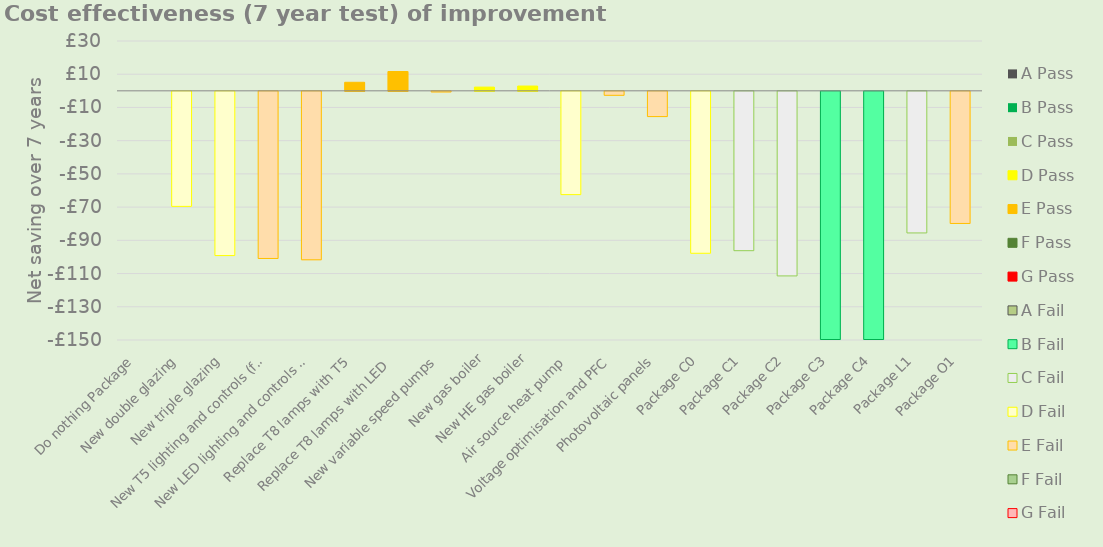
| Category | A Pass | B Pass | C Pass | D Pass | E Pass | F Pass | G Pass | A Fail | B Fail | C Fail | D Fail | E Fail | F Fail | G Fail |
|---|---|---|---|---|---|---|---|---|---|---|---|---|---|---|
| Do nothing Package | 0 | 0 | 0 | 0 | 0 | 0 | 0 | 0 | 0 | 0 | 0 | 0 | 0 | 0 |
| New double glazing | 0 | 0 | 0 | 0 | 0 | 0 | 0 | 0 | 0 | 0 | -69.256 | 0 | 0 | 0 |
| New triple glazing | 0 | 0 | 0 | 0 | 0 | 0 | 0 | 0 | 0 | 0 | -98.873 | 0 | 0 | 0 |
| New T5 lighting and controls (full) | 0 | 0 | 0 | 0 | 0 | 0 | 0 | 0 | 0 | 0 | 0 | -100.618 | 0 | 0 |
| New LED lighting and controls (full) | 0 | 0 | 0 | 0 | 0 | 0 | 0 | 0 | 0 | 0 | 0 | -101.411 | 0 | 0 |
| Replace T8 lamps with T5 | 0 | 0 | 0 | 0 | 5.145 | 0 | 0 | 0 | 0 | 0 | 0 | 0 | 0 | 0 |
| Replace T8 lamps with LED  | 0 | 0 | 0 | 0 | 11.631 | 0 | 0 | 0 | 0 | 0 | 0 | 0 | 0 | 0 |
| New variable speed pumps | 0 | 0 | 0 | 0 | 0 | 0 | 0 | 0 | 0 | 0 | 0 | -0.39 | 0 | 0 |
| New gas boiler | 0 | 0 | 0 | 2.237 | 0 | 0 | 0 | 0 | 0 | 0 | 0 | 0 | 0 | 0 |
| New HE gas boiler | 0 | 0 | 0 | 2.876 | 0 | 0 | 0 | 0 | 0 | 0 | 0 | 0 | 0 | 0 |
| Air source heat pump | 0 | 0 | 0 | 0 | 0 | 0 | 0 | 0 | 0 | 0 | -62.176 | 0 | 0 | 0 |
| Voltage optimisation and PFC | 0 | 0 | 0 | 0 | 0 | 0 | 0 | 0 | 0 | 0 | 0 | -2.394 | 0 | 0 |
| Photovoltaic panels | 0 | 0 | 0 | 0 | 0 | 0 | 0 | 0 | 0 | 0 | 0 | -15.188 | 0 | 0 |
| Package C0 | 0 | 0 | 0 | 0 | 0 | 0 | 0 | 0 | 0 | 0 | -97.486 | 0 | 0 | 0 |
| Package C1 | 0 | 0 | 0 | 0 | 0 | 0 | 0 | 0 | 0 | -95.937 | 0 | 0 | 0 | 0 |
| Package C2 | 0 | 0 | 0 | 0 | 0 | 0 | 0 | 0 | 0 | -111.125 | 0 | 0 | 0 | 0 |
| Package C3 | 0 | 0 | 0 | 0 | 0 | 0 | 0 | 0 | -160.783 | 0 | 0 | 0 | 0 | 0 |
| Package C4 | 0 | 0 | 0 | 0 | 0 | 0 | 0 | 0 | -168.914 | 0 | 0 | 0 | 0 | 0 |
| Package L1 | 0 | 0 | 0 | 0 | 0 | 0 | 0 | 0 | 0 | -85.252 | 0 | 0 | 0 | 0 |
| Package O1 | 0 | 0 | 0 | 0 | 0 | 0 | 0 | 0 | 0 | 0 | 0 | -79.542 | 0 | 0 |